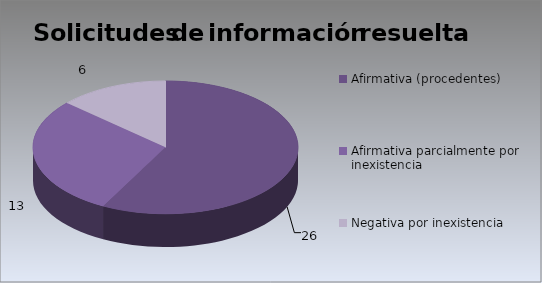
| Category | Series 0 |
|---|---|
| Afirmativa (procedentes) | 26 |
| Afirmativa parcialmente por inexistencia | 13 |
| Negativa por inexistencia | 6 |